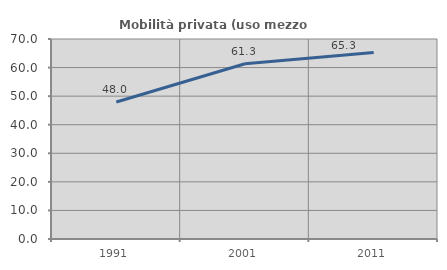
| Category | Mobilità privata (uso mezzo privato) |
|---|---|
| 1991.0 | 47.952 |
| 2001.0 | 61.338 |
| 2011.0 | 65.29 |